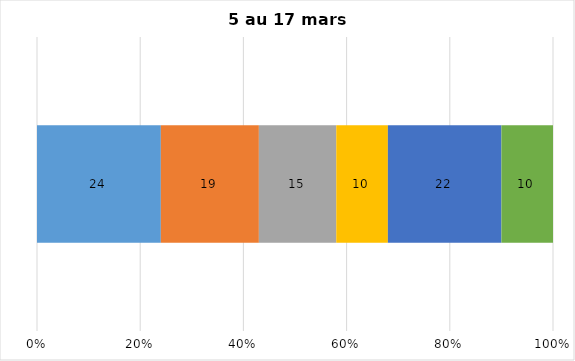
| Category | Plusieurs fois par jour | Une fois par jour | Quelques fois par semaine   | Une fois par semaine ou moins   |  Jamais   |  Je n’utilise pas les médias sociaux |
|---|---|---|---|---|---|---|
| 0 | 24 | 19 | 15 | 10 | 22 | 10 |